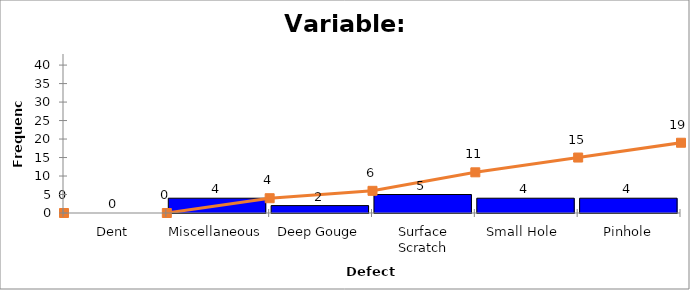
| Category | Freq |
|---|---|
| Dent | 0 |
| Miscellaneous | 4 |
| Deep Gouge | 2 |
| Surface Scratch | 5 |
| Small Hole  | 4 |
| Pinhole | 4 |